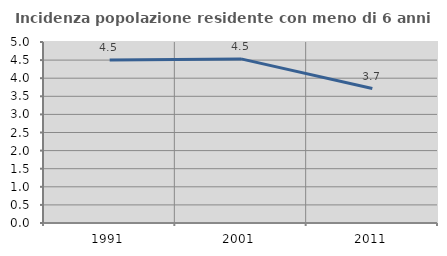
| Category | Incidenza popolazione residente con meno di 6 anni |
|---|---|
| 1991.0 | 4.501 |
| 2001.0 | 4.533 |
| 2011.0 | 3.714 |